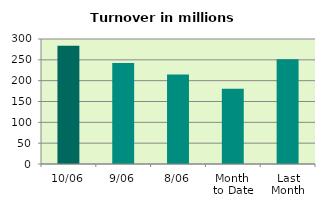
| Category | Series 0 |
|---|---|
| 10/06 | 283.862 |
| 9/06 | 242.173 |
| 8/06 | 214.861 |
| Month 
to Date | 180.682 |
| Last
Month | 251.573 |